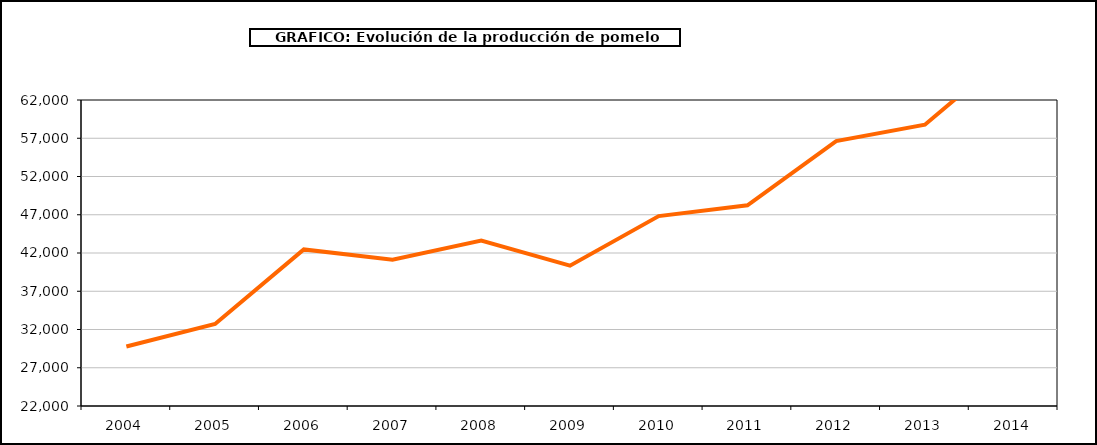
| Category | producción |
|---|---|
| 2004.0 | 29771 |
| 2005.0 | 32727 |
| 2006.0 | 42467 |
| 2007.0 | 41120 |
| 2008.0 | 43639 |
| 2009.0 | 40339 |
| 2010.0 | 46824 |
| 2011.0 | 48231 |
| 2012.0 | 56634 |
| 2013.0 | 58770 |
| 2014.0 | 68545 |